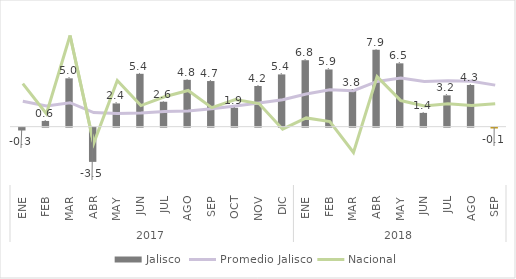
| Category | Jalisco |
|---|---|
| 0 | -0.29 |
| 1 | 0.587 |
| 2 | 4.971 |
| 3 | -3.519 |
| 4 | 2.39 |
| 5 | 5.437 |
| 6 | 2.563 |
| 7 | 4.814 |
| 8 | 4.692 |
| 9 | 1.935 |
| 10 | 4.185 |
| 11 | 5.374 |
| 12 | 6.835 |
| 13 | 5.886 |
| 14 | 3.782 |
| 15 | 7.909 |
| 16 | 6.514 |
| 17 | 1.416 |
| 18 | 3.219 |
| 19 | 4.283 |
| 20 | -0.08 |